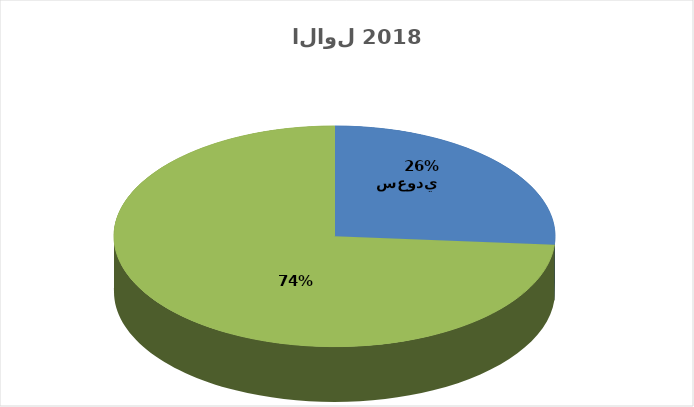
| Category | Series 0 |
|---|---|
| سعودي        | 1586037 |
| غير سعودي         | 4460983 |